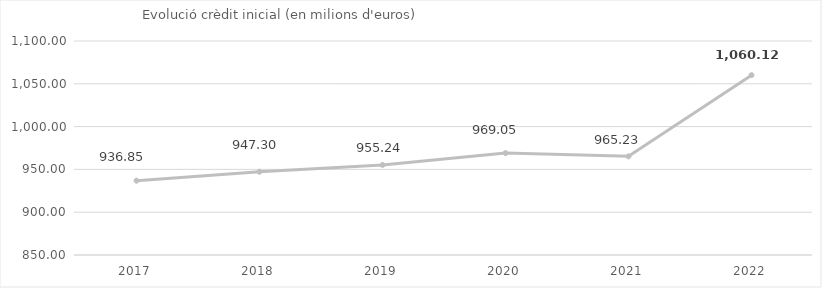
| Category | Presupuesto inicial (miliones de euros) |
|---|---|
| 2017.0 | 936.845 |
| 2018.0 | 947.3 |
| 2019.0 | 955.238 |
| 2020.0 | 969.045 |
| 2021.0 | 965.234 |
| 2022.0 | 1060.12 |